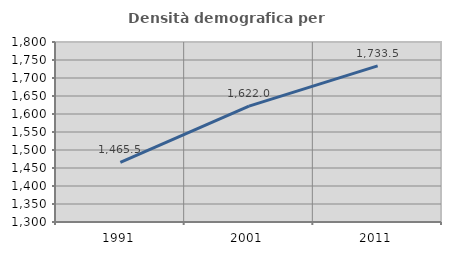
| Category | Densità demografica |
|---|---|
| 1991.0 | 1465.504 |
| 2001.0 | 1622.042 |
| 2011.0 | 1733.499 |